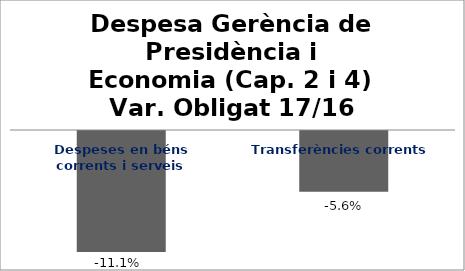
| Category | Series 0 |
|---|---|
| Despeses en béns corrents i serveis | -0.111 |
| Transferències corrents | -0.056 |